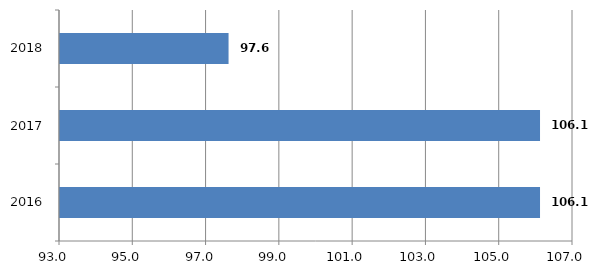
| Category | Series 0 |
|---|---|
| 2016.0 | 106.1 |
| 2017.0 | 106.1 |
| 2018.0 | 97.6 |